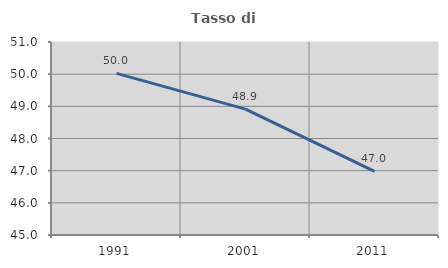
| Category | Tasso di occupazione   |
|---|---|
| 1991.0 | 50.024 |
| 2001.0 | 48.914 |
| 2011.0 | 46.977 |